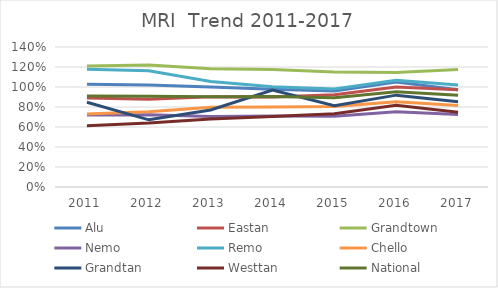
| Category | Alu | Eastan | Grandtown | Nemo | Remo | Chello | Grandtan | Westtan | National |
|---|---|---|---|---|---|---|---|---|---|
| 2011.0 | 1.027 | 0.889 | 1.211 | 0.72 | 1.178 | 0.73 | 0.847 | 0.613 | 0.911 |
| 2012.0 | 1.021 | 0.877 | 1.221 | 0.722 | 1.162 | 0.752 | 0.672 | 0.639 | 0.909 |
| 2013.0 | 1.001 | 0.902 | 1.183 | 0.704 | 1.055 | 0.796 | 0.771 | 0.679 | 0.902 |
| 2014.0 | 0.977 | 0.9 | 1.175 | 0.71 | 1.003 | 0.801 | 0.969 | 0.705 | 0.904 |
| 2015.0 | 0.96 | 0.923 | 1.149 | 0.708 | 0.979 | 0.806 | 0.813 | 0.732 | 0.893 |
| 2016.0 | 1.05 | 1 | 1.144 | 0.751 | 1.066 | 0.852 | 0.919 | 0.816 | 0.952 |
| 2017.0 | 0.974 | 0.973 | 1.175 | 0.724 | 1.019 | 0.816 | 0.853 | 0.748 | 0.918 |